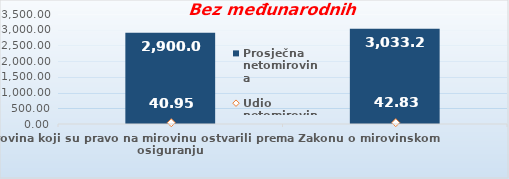
| Category | Prosječna netomirovina  |
|---|---|
| Korisnici mirovina koji su pravo na mirovinu ostvarili prema Zakonu o mirovinskom osiguranju  | 2900.08 |
| Korisnici koji su pravo na mirovinu PRVI PUT ostvarili u 2021. godini prema Zakonu o mirovinskom osiguranju - NOVI KORISNICI | 3033.252 |